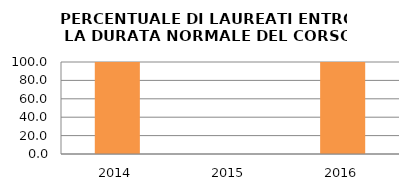
| Category | 2014 2015 2016 |
|---|---|
| 2014.0 | 100 |
| 2015.0 | 0 |
| 2016.0 | 100 |